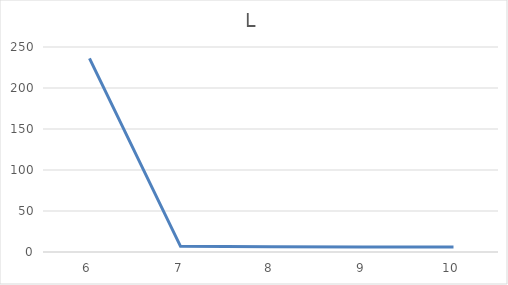
| Category | L |
|---|---|
| 6.0 | 236.137 |
| 7.0 | 6.917 |
| 8.0 | 6.263 |
| 9.0 | 6.092 |
| 10.0 | 6.032 |